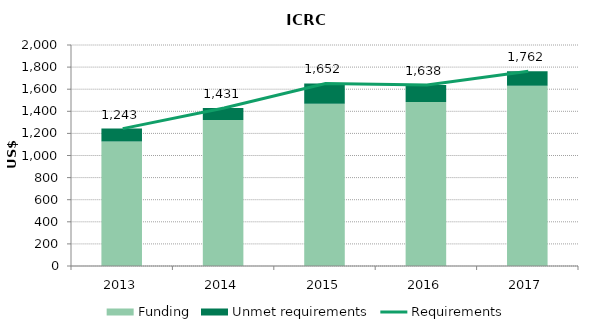
| Category | Funding | Unmet requirements |
|---|---|---|
| 2013.0 | 1127.494 | 115.906 |
| 2014.0 | 1320.399 | 110.116 |
| 2015.0 | 1467.836 | 183.912 |
| 2016.0 | 1483.918 | 154.077 |
| 2017.0 | 1631.744 | 130.235 |